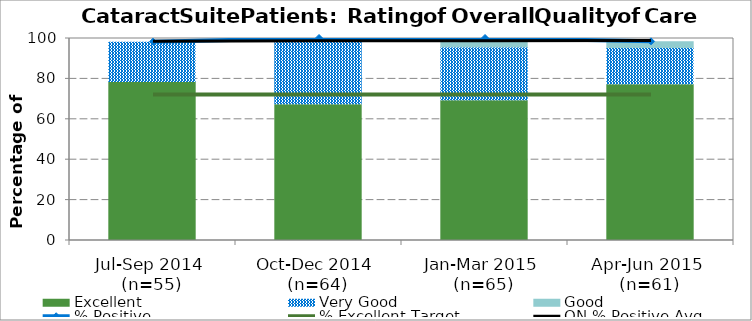
| Category | Excellent | Very Good | Good |
|---|---|---|---|
| Jul-Sep 2014 
(n=55) | 78.18 | 20 | 0 |
| Oct-Dec 2014 
(n=64) | 67.19 | 31.25 | 1.56 |
| Jan-Mar 2015 
(n=65) | 69.23 | 26.15 | 4.62 |
| Apr-Jun 2015 
(n=61)
   | 77.05 | 18.03 | 3.28 |